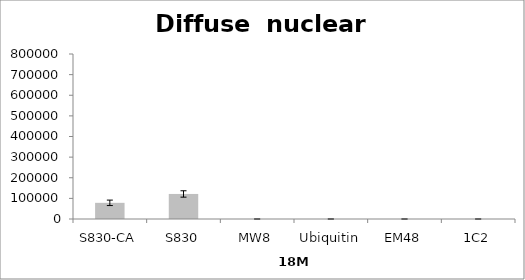
| Category | Series 0 |
|---|---|
| S830-CA | 78397.397 |
| S830 | 121411.494 |
| MW8 | 0 |
| Ubiquitin | 0 |
| EM48 | 0 |
| 1C2 | 0 |